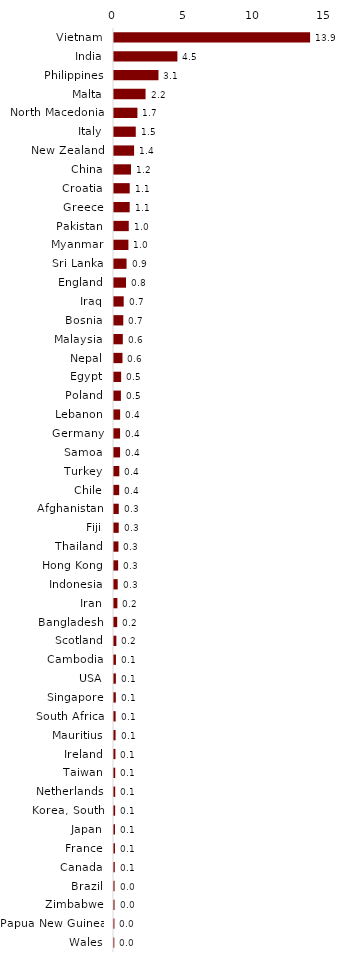
| Category | Series 0 |
|---|---|
| Vietnam | 13.874 |
| India | 4.486 |
| Philippines | 3.147 |
| Malta | 2.233 |
| North Macedonia | 1.657 |
| Italy | 1.54 |
| New Zealand | 1.421 |
| China | 1.203 |
| Croatia | 1.112 |
| Greece | 1.11 |
| Pakistan | 1.044 |
| Myanmar | 1.02 |
| Sri Lanka | 0.887 |
| England | 0.849 |
| Iraq | 0.686 |
| Bosnia | 0.657 |
| Malaysia | 0.623 |
| Nepal | 0.6 |
| Egypt | 0.505 |
| Poland | 0.489 |
| Lebanon | 0.434 |
| Germany | 0.429 |
| Samoa | 0.429 |
| Turkey | 0.376 |
| Chile | 0.367 |
| Afghanistan | 0.338 |
| Fiji | 0.336 |
| Thailand | 0.314 |
| Hong Kong | 0.294 |
| Indonesia | 0.261 |
| Iran | 0.24 |
| Bangladesh | 0.227 |
| Scotland | 0.167 |
| Cambodia | 0.137 |
| USA | 0.133 |
| Singapore | 0.128 |
| South Africa | 0.116 |
| Mauritius | 0.111 |
| Ireland | 0.101 |
| Taiwan | 0.085 |
| Netherlands | 0.084 |
| Korea, South | 0.079 |
| Japan | 0.069 |
| France | 0.068 |
| Canada | 0.055 |
| Brazil | 0.04 |
| Zimbabwe | 0.038 |
| Papua New Guinea | 0.03 |
| Wales | 0.022 |